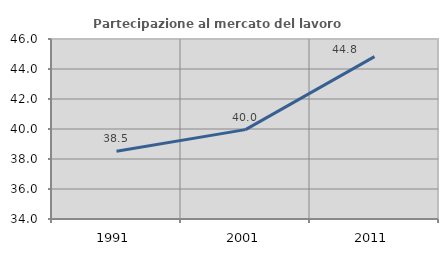
| Category | Partecipazione al mercato del lavoro  femminile |
|---|---|
| 1991.0 | 38.522 |
| 2001.0 | 39.959 |
| 2011.0 | 44.822 |